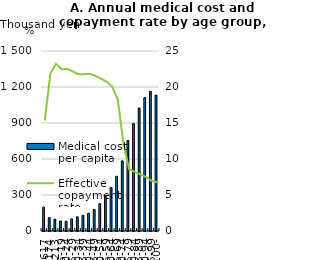
| Category | Medical cost per capita |
|---|---|
| 36617 | 198.662 |
| 45174 | 111.433 |
| 45213 | 98.545 |
| 15-19 | 83.799 |
| 20-24 | 82.252 |
| 25-29 | 101.462 |
| 30-34 | 118.116 |
| 35-39 | 130.568 |
| 40-44 | 148.118 |
| 45-49 | 179.742 |
| 50-54 | 227.878 |
| 55-59 | 286.982 |
| 60-64 | 363.53 |
| 65-69 | 456.173 |
| 70-74 | 584.142 |
| 75-79 | 754.958 |
| 80-84 | 894.826 |
| 85-89 | 1024.422 |
| 90-94 | 1111.546 |
| 95-99 | 1163.543 |
| 100- | 1132.256 |